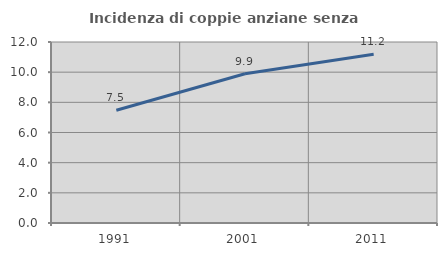
| Category | Incidenza di coppie anziane senza figli  |
|---|---|
| 1991.0 | 7.477 |
| 2001.0 | 9.894 |
| 2011.0 | 11.188 |